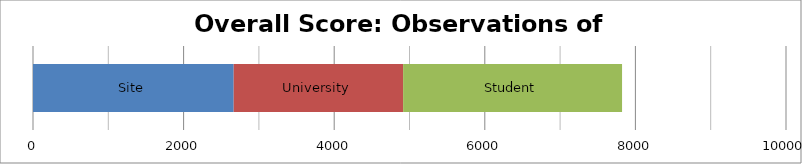
| Category | Site | University | Student |
|---|---|---|---|
| 0 | 2665.25 | 2250 | 2907.5 |